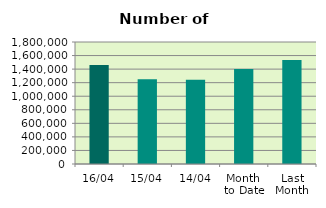
| Category | Series 0 |
|---|---|
| 16/04 | 1460802 |
| 15/04 | 1250772 |
| 14/04 | 1242248 |
| Month 
to Date | 1402282.6 |
| Last
Month | 1535393.739 |